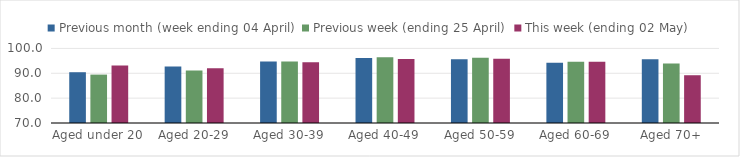
| Category | Previous month (week ending 04 April) | Previous week (ending 25 April) | This week (ending 02 May) |
|---|---|---|---|
| Aged under 20 | 90.43 | 89.47 | 93.111 |
| Aged 20-29 | 92.705 | 91.117 | 92.07 |
| Aged 30-39 | 94.706 | 94.781 | 94.476 |
| Aged 40-49 | 96.19 | 96.442 | 95.782 |
| Aged 50-59 | 95.676 | 96.253 | 95.888 |
| Aged 60-69 | 94.261 | 94.629 | 94.616 |
| Aged 70+ | 95.692 | 93.934 | 89.218 |